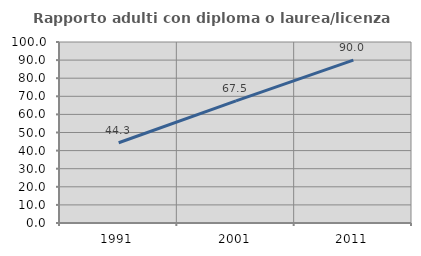
| Category | Rapporto adulti con diploma o laurea/licenza media  |
|---|---|
| 1991.0 | 44.318 |
| 2001.0 | 67.477 |
| 2011.0 | 89.97 |